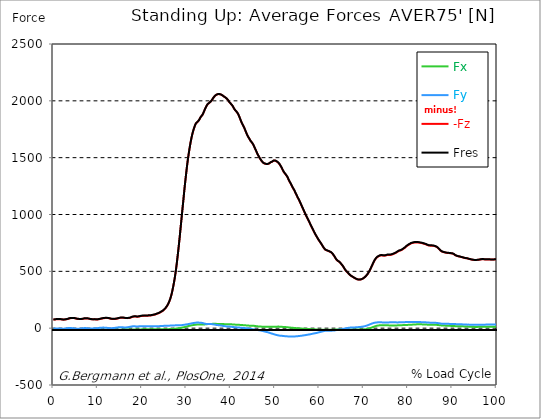
| Category |  Fx |  Fy |  -Fz |  Fres |
|---|---|---|---|---|
| 0.0 | -13.943 | -4.702 | 74.83 | 76.537 |
| 0.167348456675344 | -14.591 | -3.907 | 75.139 | 76.89 |
| 0.334696913350688 | -15.098 | -3.127 | 75.779 | 77.574 |
| 0.5020453700260321 | -15.4 | -2.789 | 77.03 | 78.855 |
| 0.669393826701376 | -15.694 | -2.45 | 78.281 | 80.128 |
| 0.83674228337672 | -15.694 | -2.156 | 78.597 | 80.407 |
| 1.0040907400520642 | -15.356 | -1.979 | 78.936 | 80.65 |
| 1.1621420602454444 | -14.995 | -1.972 | 79.201 | 80.812 |
| 1.3294905169207885 | -14.525 | -2.399 | 79.23 | 80.746 |
| 1.4968389735961325 | -13.781 | -3.171 | 78.708 | 80.128 |
| 1.6641874302714765 | -13.2 | -3.708 | 78.119 | 79.48 |
| 1.8315358869468206 | -12.744 | -4.268 | 77.111 | 78.487 |
| 1.9988843436221646 | -12.383 | -4.731 | 76.029 | 77.442 |
| 2.1662328002975086 | -12.251 | -4.753 | 75.213 | 76.618 |
| 2.333581256972853 | -12.332 | -4.407 | 74.823 | 76.199 |
| 2.5009297136481967 | -12.589 | -3.767 | 75.345 | 76.714 |
| 2.6682781703235405 | -12.825 | -3.024 | 76.36 | 77.714 |
| 2.8356266269988843 | -13.266 | -2.082 | 77.398 | 78.818 |
| 3.002975083674229 | -13.826 | -1.192 | 78.538 | 80.032 |
| 3.1703235403495724 | -14.436 | -0.412 | 79.841 | 81.386 |
| 3.337671997024917 | -15.157 | 0.434 | 81.975 | 83.608 |
| 3.4957233172182973 | -15.797 | 1.089 | 84.461 | 86.176 |
| 3.663071773893641 | -16.026 | 1.398 | 86.249 | 88.008 |
| 3.8304202305689854 | -15.974 | 1.31 | 87.618 | 89.34 |
| 3.997768687244329 | -15.613 | 0.846 | 88.295 | 89.958 |
| 4.165117143919673 | -15.179 | 0.324 | 88.788 | 90.37 |
| 4.332465600595017 | -14.642 | -0.316 | 89.009 | 90.51 |
| 4.499814057270361 | -13.929 | -1.155 | 88.781 | 90.201 |
| 4.667162513945706 | -13.156 | -2.112 | 88.273 | 89.619 |
| 4.834510970621049 | -12.325 | -3.157 | 87.206 | 88.494 |
| 5.001859427296393 | -11.581 | -4.098 | 85.83 | 87.096 |
| 5.169207883971737 | -11.133 | -4.635 | 84.241 | 85.506 |
| 5.336556340647081 | -10.691 | -5.04 | 82.578 | 83.843 |
| 5.503904797322425 | -10.522 | -5.084 | 81.562 | 82.828 |
| 5.671253253997769 | -10.559 | -4.9 | 80.738 | 81.997 |
| 5.82930457419115 | -10.816 | -4.415 | 80.113 | 81.364 |
| 5.996653030866494 | -11.169 | -3.797 | 79.649 | 80.908 |
| 6.164001487541838 | -11.626 | -3.009 | 79.657 | 80.944 |
| 6.331349944217181 | -12.06 | -2.259 | 80.054 | 81.393 |
| 6.498698400892526 | -12.663 | -1.317 | 80.878 | 82.291 |
| 6.66604685756787 | -13.23 | -0.53 | 82.232 | 83.733 |
| 6.833395314243213 | -13.546 | 0.088 | 83.645 | 85.271 |
| 7.000743770918558 | -13.811 | 0.662 | 85.021 | 86.757 |
| 7.168092227593902 | -13.796 | 0.831 | 85.712 | 87.434 |
| 7.335440684269246 | -13.399 | 0.567 | 86.058 | 87.706 |
| 7.50278914094459 | -12.634 | -0.103 | 86.154 | 87.692 |
| 7.6701375976199335 | -11.979 | -0.854 | 85.676 | 87.14 |
| 7.837486054295278 | -11.339 | -1.766 | 84.697 | 86.11 |
| 7.995537374488658 | -10.757 | -2.458 | 83.461 | 84.8 |
| 8.162885831164003 | -10.08 | -3.186 | 81.629 | 82.96 |
| 8.330234287839346 | -9.595 | -3.605 | 80.113 | 81.445 |
| 8.49758274451469 | -9.477 | -3.539 | 79.12 | 80.466 |
| 8.664931201190035 | -9.587 | -3.134 | 77.979 | 79.333 |
| 8.832279657865378 | -9.742 | -2.656 | 77.405 | 78.803 |
| 8.999628114540721 | -10.044 | -1.942 | 77.199 | 78.641 |
| 9.166976571216066 | -10.492 | -1.185 | 77.552 | 79.002 |
| 9.334325027891412 | -10.787 | -0.728 | 78.126 | 79.583 |
| 9.501673484566755 | -10.595 | -0.979 | 77.391 | 78.818 |
| 9.669021941242098 | -10.691 | -1.045 | 76.397 | 77.869 |
| 9.836370397917442 | -11.147 | -0.302 | 76.397 | 77.95 |
| 10.003718854592787 | -11.581 | 0.522 | 76.993 | 78.597 |
| 10.17106731126813 | -12.118 | 1.383 | 77.935 | 79.598 |
| 10.329118631461512 | -12.759 | 2.31 | 79.083 | 80.827 |
| 10.496467088136853 | -13.516 | 3.171 | 80.51 | 82.342 |
| 10.663815544812199 | -14.304 | 3.929 | 82.107 | 84.057 |
| 10.831164001487544 | -14.65 | 4.304 | 83.689 | 85.676 |
| 10.998512458162887 | -14.959 | 4.68 | 85.168 | 87.184 |
| 11.16586091483823 | -15.106 | 4.93 | 86.536 | 88.56 |
| 11.333209371513574 | -14.966 | 4.893 | 87.662 | 89.649 |
| 11.50055782818892 | -14.686 | 4.731 | 88.523 | 90.443 |
| 11.667906284864264 | -14.105 | 4.268 | 88.92 | 90.73 |
| 11.835254741539607 | -13.539 | 3.856 | 89.215 | 90.922 |
| 12.00260319821495 | -12.928 | 3.311 | 89.399 | 91.003 |
| 12.169951654890292 | -12.258 | 2.619 | 89.266 | 90.767 |
| 12.337300111565641 | -11.5 | 1.707 | 88.773 | 90.186 |
| 12.504648568240984 | -10.779 | 0.743 | 87.78 | 89.141 |
| 12.662699888434362 | -10.316 | 0.162 | 86.095 | 87.464 |
| 12.830048345109708 | -10.021 | -0.044 | 84.138 | 85.492 |
| 12.997396801785053 | -9.83 | -0.132 | 82.497 | 83.836 |
| 13.164745258460396 | -9.808 | 0.052 | 81.643 | 82.96 |
| 13.33209371513574 | -9.882 | 0.405 | 81.268 | 82.556 |
| 13.499442171811083 | -10.169 | 0.986 | 81.224 | 82.519 |
| 13.666790628486426 | -10.566 | 1.641 | 81.393 | 82.718 |
| 13.834139085161771 | -10.949 | 2.48 | 81.695 | 83.078 |
| 14.001487541837117 | -11.397 | 3.326 | 81.857 | 83.321 |
| 14.16883599851246 | -11.957 | 4.29 | 82.571 | 84.13 |
| 14.336184455187803 | -12.611 | 5.349 | 83.726 | 85.403 |
| 14.503532911863147 | -13.296 | 6.423 | 85.109 | 86.926 |
| 14.670881368538492 | -13.929 | 7.277 | 86.948 | 88.898 |
| 14.828932688731873 | -14.296 | 7.836 | 88.795 | 90.789 |
| 14.996281145407215 | -14.311 | 8.094 | 90.377 | 92.334 |
| 15.163629602082558 | -14.061 | 8.292 | 91.429 | 93.32 |
| 15.330978058757903 | -13.561 | 8.219 | 92.062 | 93.835 |
| 15.498326515433247 | -12.913 | 7.895 | 92.334 | 93.968 |
| 15.665674972108594 | -12.111 | 7.336 | 92.202 | 93.696 |
| 15.833023428783937 | -11.236 | 6.644 | 91.65 | 92.975 |
| 16.00037188545928 | -10.669 | 6.335 | 90.686 | 91.937 |
| 16.167720342134626 | -10.308 | 6.203 | 89.619 | 90.826 |
| 16.335068798809967 | -10.11 | 6.232 | 88.633 | 89.825 |
| 16.502417255485312 | -10.161 | 6.674 | 88.177 | 89.413 |
| 16.669765712160658 | -10.419 | 7.535 | 88.266 | 89.612 |
| 16.837114168836 | -10.787 | 8.631 | 88.597 | 90.09 |
| 17.004462625511344 | -11.228 | 9.86 | 89.2 | 90.878 |
| 17.16251394570472 | -11.714 | 11.199 | 90.009 | 91.893 |
| 17.32986240238007 | -12.273 | 12.501 | 91.172 | 93.276 |
| 17.497210859055414 | -12.817 | 13.848 | 93.328 | 95.668 |
| 17.664559315730756 | -13.075 | 15.216 | 96.985 | 99.486 |
| 17.8319077724061 | -13.024 | 15.93 | 99.199 | 101.745 |
| 17.999256229081443 | -12.825 | 16.32 | 100.921 | 103.46 |
| 18.166604685756788 | -12.538 | 16.371 | 101.87 | 104.372 |
| 18.333953142432133 | -12.126 | 16.165 | 102.319 | 104.769 |
| 18.501301599107478 | -11.522 | 15.621 | 102.334 | 104.688 |
| 18.668650055782823 | -11.133 | 15.334 | 101.576 | 103.886 |
| 18.835998512458165 | -10.787 | 15.106 | 100.745 | 103.018 |
| 19.00334696913351 | -10.625 | 15.209 | 100.73 | 102.974 |
| 19.170695425808855 | -10.72 | 15.591 | 101.495 | 103.739 |
| 19.338043882484197 | -10.927 | 16.04 | 102.297 | 104.585 |
| 19.496095202677576 | -10.853 | 16.386 | 103.813 | 106.153 |
| 19.66344365935292 | -10.941 | 17.056 | 105.542 | 108.029 |
| 19.830792116028263 | -10.809 | 17.446 | 106.94 | 109.508 |
| 19.998140572703612 | -10.301 | 17.159 | 107.999 | 110.516 |
| 20.165489029378953 | -10.066 | 16.997 | 108.154 | 110.634 |
| 20.3328374860543 | -10.095 | 17.115 | 108.088 | 110.582 |
| 20.500185942729644 | -10.242 | 17.409 | 108.654 | 111.156 |
| 20.667534399404985 | -9.742 | 17.004 | 108.676 | 111.119 |
| 20.83488285608033 | -9.389 | 16.644 | 108.434 | 110.832 |
| 21.002231312755672 | -9.212 | 16.467 | 108.228 | 110.604 |
| 21.16957976943102 | -9.05 | 16.68 | 108.765 | 111.208 |
| 21.336928226106362 | -8.991 | 17.115 | 109.684 | 112.223 |
| 21.504276682781704 | -9.116 | 17.482 | 111.082 | 113.694 |
| 21.67162513945705 | -8.984 | 17.372 | 112.046 | 114.607 |
| 21.82967645965043 | -8.829 | 16.931 | 111.987 | 114.438 |
| 21.997024916325774 | -8.682 | 16.489 | 111.921 | 114.261 |
| 22.16437337300112 | -8.756 | 16.577 | 112.517 | 114.82 |
| 22.33172182967646 | -8.91 | 16.894 | 114.504 | 116.844 |
| 22.499070286351806 | -8.822 | 16.989 | 116.24 | 118.558 |
| 22.666418743027148 | -8.8 | 16.931 | 117.535 | 119.831 |
| 22.833767199702496 | -8.778 | 16.872 | 118.83 | 121.097 |
| 23.00111565637784 | -8.903 | 16.732 | 120.295 | 122.502 |
| 23.168464113053183 | -9.168 | 16.931 | 122.583 | 124.79 |
| 23.335812569728528 | -9.727 | 17.534 | 126.026 | 128.3 |
| 23.50316102640387 | -10.066 | 17.777 | 129.014 | 131.287 |
| 23.670509483079215 | -9.823 | 17.313 | 130.331 | 132.494 |
| 23.83785793975456 | -10.007 | 17.622 | 133.171 | 135.334 |
| 23.995909259947936 | -10.25 | 18.049 | 136.254 | 138.447 |
| 24.163257716623285 | -10.47 | 18.498 | 139.558 | 141.765 |
| 24.330606173298627 | -10.492 | 18.991 | 144.208 | 146.437 |
| 24.49795462997397 | -10.404 | 19.248 | 148.115 | 150.322 |
| 24.665303086649313 | -10.308 | 19.506 | 152.015 | 154.207 |
| 24.83265154332466 | -10.272 | 20.102 | 157.607 | 159.762 |
| 25.0 | -10.11 | 20.529 | 163.441 | 165.546 |
| 25.167348456675345 | -9.882 | 20.852 | 169.357 | 171.403 |
| 25.334696913350694 | -9.624 | 21.08 | 177.407 | 179.379 |
| 25.502045370026035 | -9.374 | 21.309 | 186.244 | 188.142 |
| 25.669393826701377 | -9.161 | 21.632 | 195.882 | 197.707 |
| 25.836742283376722 | -8.844 | 21.743 | 207.317 | 209.053 |
| 26.004090740052067 | -8.491 | 21.802 | 220.546 | 222.187 |
| 26.17143919672741 | -8.226 | 21.978 | 236.314 | 237.852 |
| 26.329490516920792 | -7.969 | 22.464 | 253.495 | 254.952 |
| 26.49683897359613 | -7.866 | 23.03 | 273.817 | 275.208 |
| 26.66418743027148 | -7.593 | 23.56 | 298.113 | 299.423 |
| 26.831535886946828 | -6.997 | 23.972 | 326.007 | 327.221 |
| 26.998884343622166 | -6.232 | 24.141 | 357.779 | 358.89 |
| 27.166232800297514 | -5.732 | 24.281 | 391.883 | 392.905 |
| 27.333581256972852 | -5.43 | 24.494 | 428.466 | 429.415 |
| 27.5009297136482 | -4.849 | 24.649 | 470.001 | 470.877 |
| 27.668278170323543 | -3.9 | 24.723 | 515.444 | 516.239 |
| 27.835626626998888 | -2.951 | 24.759 | 566.552 | 567.266 |
| 28.002975083674233 | -2.163 | 24.848 | 621.891 | 622.538 |
| 28.170323540349575 | -1.53 | 25.127 | 678.363 | 678.952 |
| 28.33767199702492 | -0.736 | 25.473 | 738.713 | 739.257 |
| 28.50502045370026 | 0.346 | 25.856 | 801.476 | 801.983 |
| 28.663071773893645 | 1.56 | 25.907 | 867.586 | 868.057 |
| 28.830420230568986 | 2.943 | 26.172 | 932.984 | 933.425 |
| 28.99776868724433 | 4.253 | 26.783 | 998.874 | 999.315 |
| 29.165117143919673 | 5.504 | 27.607 | 1064.028 | 1064.477 |
| 29.33246560059502 | 6.909 | 28.828 | 1128.388 | 1128.851 |
| 29.499814057270367 | 8.631 | 29.88 | 1195.271 | 1195.757 |
| 29.66716251394571 | 10.316 | 30.852 | 1258.821 | 1259.329 |
| 29.834510970621054 | 11.905 | 31.654 | 1316.905 | 1317.427 |
| 30.00185942729639 | 13.715 | 32.846 | 1374.547 | 1375.106 |
| 30.169207883971744 | 15.533 | 33.957 | 1430.872 | 1431.468 |
| 30.33655634064708 | 17.247 | 35.09 | 1480.567 | 1481.207 |
| 30.50390479732243 | 18.969 | 36.451 | 1525.435 | 1526.127 |
| 30.671253253997772 | 20.484 | 37.643 | 1567.677 | 1568.406 |
| 30.829304574191156 | 21.875 | 38.894 | 1607.123 | 1607.896 |
| 30.996653030866494 | 23.266 | 40.446 | 1643.184 | 1644.001 |
| 31.164001487541842 | 24.73 | 42.05 | 1675.257 | 1676.126 |
| 31.331349944217187 | 26.076 | 43.338 | 1703.732 | 1704.645 |
| 31.498698400892525 | 27.173 | 44.457 | 1729.147 | 1730.088 |
| 31.666046857567874 | 28.137 | 45.59 | 1750.919 | 1751.89 |
| 31.833395314243212 | 29.086 | 46.664 | 1770.491 | 1771.499 |
| 32.00074377091856 | 30.094 | 47.532 | 1788.025 | 1789.062 |
| 32.1680922275939 | 30.933 | 48.636 | 1801.769 | 1802.851 |
| 32.33544068426925 | 31.477 | 49.158 | 1807.957 | 1809.054 |
| 32.50278914094459 | 31.933 | 49.386 | 1813.719 | 1814.83 |
| 32.670137597619934 | 32.287 | 49.298 | 1819.259 | 1820.37 |
| 32.83748605429528 | 32.5 | 48.901 | 1828.618 | 1829.707 |
| 33.004834510970625 | 32.64 | 48.4 | 1839.699 | 1840.766 |
| 33.162885831164004 | 32.699 | 47.79 | 1852.738 | 1853.782 |
| 33.33023428783935 | 32.809 | 47.194 | 1861.861 | 1862.884 |
| 33.497582744514695 | 32.75 | 46.259 | 1869.528 | 1870.514 |
| 33.664931201190036 | 32.654 | 45.141 | 1878.071 | 1879.02 |
| 33.83227965786538 | 32.816 | 43.603 | 1892.308 | 1893.213 |
| 33.99962811454073 | 32.816 | 41.351 | 1907.878 | 1908.731 |
| 34.16697657121607 | 33.096 | 38.916 | 1923.432 | 1924.249 |
| 34.33432502789141 | 33.582 | 38.18 | 1937.376 | 1938.185 |
| 34.50167348456676 | 34.479 | 37.805 | 1950.487 | 1951.312 |
| 34.6690219412421 | 35.083 | 36.841 | 1962.562 | 1963.379 |
| 34.83637039791744 | 35.965 | 36.841 | 1971.377 | 1972.208 |
| 35.00371885459279 | 36.422 | 36.974 | 1976.387 | 1977.233 |
| 35.17106731126814 | 36.929 | 36.672 | 1982.274 | 1983.127 |
| 35.338415767943474 | 37.15 | 36.436 | 1987.844 | 1988.697 |
| 35.49646708813686 | 37.283 | 36.252 | 1993.23 | 1994.09 |
| 35.6638155448122 | 37.444 | 35.826 | 2000.654 | 2001.5 |
| 35.831164001487544 | 37.65 | 35.141 | 2010.594 | 2011.433 |
| 35.998512458162885 | 38.004 | 34.185 | 2021.013 | 2021.837 |
| 36.165860914838234 | 38.401 | 33.184 | 2030.262 | 2031.079 |
| 36.333209371513576 | 38.651 | 32.029 | 2038.672 | 2039.474 |
| 36.50055782818892 | 38.644 | 30.572 | 2045.544 | 2046.324 |
| 36.667906284864266 | 38.21 | 29.262 | 2050.901 | 2051.659 |
| 36.83525474153961 | 37.709 | 28.137 | 2054.506 | 2055.235 |
| 37.002603198214956 | 37.209 | 27.504 | 2057.979 | 2058.686 |
| 37.1699516548903 | 36.981 | 26.834 | 2059.23 | 2059.929 |
| 37.337300111565646 | 36.797 | 25.915 | 2059.326 | 2060.01 |
| 37.50464856824098 | 36.848 | 25.127 | 2058.789 | 2059.473 |
| 37.66269988843437 | 36.863 | 24.215 | 2057.214 | 2057.891 |
| 37.83004834510971 | 36.819 | 23.067 | 2054.742 | 2055.419 |
| 37.99739680178505 | 36.701 | 21.919 | 2051.49 | 2052.166 |
| 38.16474525846039 | 36.392 | 20.779 | 2047.016 | 2047.678 |
| 38.33209371513574 | 35.796 | 19.557 | 2041.689 | 2042.329 |
| 38.49944217181109 | 35.443 | 18.513 | 2037.252 | 2037.885 |
| 38.666790628486424 | 35.377 | 17.652 | 2033.029 | 2033.654 |
| 38.83413908516178 | 35.252 | 16.747 | 2028.717 | 2029.342 |
| 39.001487541837115 | 35.053 | 15.812 | 2024.317 | 2024.935 |
| 39.16883599851246 | 34.847 | 15.187 | 2017.584 | 2018.195 |
| 39.336184455187805 | 34.604 | 14.856 | 2010.212 | 2010.83 |
| 39.503532911863154 | 34.45 | 14.591 | 2001.419 | 2002.03 |
| 39.670881368538495 | 34.06 | 14.738 | 1990.411 | 1991.022 |
| 39.83822982521384 | 33.868 | 13.929 | 1983.076 | 1983.686 |
| 39.996281145407224 | 33.751 | 13.046 | 1975.968 | 1976.579 |
| 40.163629602082565 | 33.596 | 12.118 | 1968.728 | 1969.338 |
| 40.33097805875791 | 33.272 | 11.39 | 1960.318 | 1960.928 |
| 40.498326515433256 | 32.919 | 10.662 | 1951.341 | 1951.959 |
| 40.6656749721086 | 32.345 | 9.882 | 1938.604 | 1939.222 |
| 40.83302342878393 | 31.749 | 9.036 | 1927.568 | 1928.186 |
| 41.00037188545929 | 31.234 | 8.285 | 1918.731 | 1919.349 |
| 41.16772034213463 | 30.771 | 7.674 | 1911.387 | 1912.006 |
| 41.33506879880997 | 30.447 | 7.064 | 1903.816 | 1904.449 |
| 41.50241725548531 | 30.212 | 6.446 | 1896.112 | 1896.753 |
| 41.66976571216066 | 29.925 | 5.975 | 1885.782 | 1886.422 |
| 41.837114168836 | 29.586 | 5.599 | 1871.125 | 1871.772 |
| 42.004462625511344 | 29.159 | 5.033 | 1855.188 | 1855.828 |
| 42.17181108218669 | 28.519 | 4.422 | 1838.309 | 1838.956 |
| 42.32986240238007 | 27.82 | 3.694 | 1821.974 | 1822.614 |
| 42.497210859055414 | 27.165 | 3.223 | 1806.081 | 1806.714 |
| 42.66455931573076 | 26.908 | 2.693 | 1793.021 | 1793.661 |
| 42.831907772406105 | 26.643 | 2.207 | 1780.954 | 1781.601 |
| 42.999256229081446 | 26.349 | 1.678 | 1768.328 | 1768.975 |
| 43.16660468575679 | 25.525 | 0.831 | 1752.751 | 1753.406 |
| 43.33395314243214 | 24.892 | 0.125 | 1736.483 | 1737.13 |
| 43.50130159910748 | 24.436 | -0.346 | 1720.597 | 1721.252 |
| 43.66865005578282 | 23.906 | -0.839 | 1705.469 | 1706.116 |
| 43.83599851245817 | 23.133 | -1.472 | 1691.114 | 1691.768 |
| 44.00334696913351 | 22.655 | -2.428 | 1679.65 | 1680.312 |
| 44.17069542580886 | 22.42 | -3.613 | 1670.32 | 1670.997 |
| 44.3380438824842 | 21.963 | -4.738 | 1657.547 | 1658.246 |
| 44.49609520267758 | 21.765 | -6.011 | 1646.532 | 1647.246 |
| 44.66344365935292 | 21.802 | -7.233 | 1638.762 | 1639.513 |
| 44.83079211602827 | 21.618 | -8.587 | 1631.169 | 1631.963 |
| 44.99814057270361 | 21.426 | -9.676 | 1620.978 | 1621.802 |
| 45.16548902937895 | 21.139 | -10.632 | 1609.043 | 1609.882 |
| 45.332837486054295 | 20.278 | -11.699 | 1594.225 | 1595.071 |
| 45.500185942729644 | 19.476 | -12.545 | 1580.053 | 1580.914 |
| 45.66753439940499 | 18.63 | -13.524 | 1565.911 | 1566.787 |
| 45.83488285608033 | 17.49 | -14.583 | 1551.159 | 1552.056 |
| 46.00223131275568 | 16.423 | -15.672 | 1536.296 | 1537.208 |
| 46.16957976943102 | 15.65 | -16.82 | 1523.11 | 1524.06 |
| 46.336928226106366 | 15.032 | -17.806 | 1511.374 | 1512.346 |
| 46.50427668278171 | 14.591 | -18.844 | 1499.617 | 1500.61 |
| 46.671625139457056 | 14.193 | -20.065 | 1488.962 | 1489.978 |
| 46.829676459650436 | 13.811 | -21.235 | 1479.132 | 1480.162 |
| 46.99702491632577 | 13.406 | -22.434 | 1470.001 | 1471.038 |
| 47.16437337300112 | 12.913 | -24.185 | 1462.106 | 1463.143 |
| 47.33172182967646 | 12.494 | -26.025 | 1455.064 | 1456.109 |
| 47.49907028635181 | 12.428 | -27.806 | 1450.569 | 1451.606 |
| 47.66641874302716 | 12.597 | -29.498 | 1448.251 | 1449.281 |
| 47.83376719970249 | 12.729 | -31.205 | 1446.61 | 1447.662 |
| 48.001115656377834 | 12.795 | -32.434 | 1444.263 | 1445.33 |
| 48.16846411305319 | 12.832 | -33.765 | 1442.519 | 1443.615 |
| 48.33581256972853 | 12.935 | -35.487 | 1443.667 | 1444.771 |
| 48.50316102640387 | 13.06 | -37.18 | 1446.073 | 1447.169 |
| 48.67050948307921 | 13.156 | -39.365 | 1448.81 | 1449.899 |
| 48.837857939754564 | 12.626 | -41.786 | 1453.644 | 1454.777 |
| 49.005206396429905 | 12.082 | -44.228 | 1458.611 | 1459.81 |
| 49.163257716623285 | 12.074 | -46.237 | 1460.178 | 1461.414 |
| 49.33060617329863 | 12.339 | -48.091 | 1463.835 | 1465.123 |
| 49.49795462997397 | 12.582 | -50.041 | 1468.625 | 1469.979 |
| 49.66530308664932 | 12.589 | -52.094 | 1473.018 | 1474.43 |
| 49.832651543324666 | 12.413 | -54.449 | 1474.747 | 1476.226 |
| 50.0 | 12.383 | -56.788 | 1474.372 | 1475.924 |
| 50.16734845667534 | 12.751 | -58.422 | 1472.664 | 1474.283 |
| 50.33469691335069 | 12.854 | -59.761 | 1467.926 | 1469.589 |
| 50.50204537002604 | 13.362 | -61.233 | 1463.798 | 1465.513 |
| 50.66939382670139 | 13.87 | -62.822 | 1458.523 | 1460.274 |
| 50.836742283376715 | 13.649 | -64.065 | 1451.746 | 1453.556 |
| 51.00409074005207 | 13.347 | -65.493 | 1443.718 | 1445.595 |
| 51.17143919672741 | 13.038 | -66.582 | 1433.557 | 1435.478 |
| 51.32949051692079 | 12.678 | -67.259 | 1422.712 | 1424.654 |
| 51.496838973596134 | 12.185 | -67.575 | 1410.52 | 1412.469 |
| 51.66418743027148 | 11.412 | -67.818 | 1397.091 | 1399.056 |
| 51.831535886946824 | 10.36 | -68.326 | 1384.083 | 1386.099 |
| 51.99888434362217 | 9.889 | -69.363 | 1373.024 | 1375.091 |
| 52.16623280029752 | 9.705 | -70.378 | 1364.032 | 1366.159 |
| 52.33358125697285 | 9.528 | -70.974 | 1355.637 | 1357.8 |
| 52.5009297136482 | 9.293 | -71.298 | 1347.308 | 1349.493 |
| 52.668278170323546 | 8.866 | -71.784 | 1337.941 | 1340.148 |
| 52.835626626998895 | 8.057 | -72.343 | 1326.301 | 1328.523 |
| 53.00297508367424 | 7.071 | -72.843 | 1312.321 | 1314.572 |
| 53.17032354034958 | 6.203 | -73.329 | 1298.517 | 1300.806 |
| 53.33767199702492 | 5.437 | -73.587 | 1286.024 | 1288.334 |
| 53.50502045370027 | 4.93 | -73.329 | 1274.067 | 1276.37 |
| 53.663071773893655 | 4.282 | -73.314 | 1260.83 | 1263.148 |
| 53.83042023056899 | 3.679 | -73.366 | 1247.696 | 1250.029 |
| 53.99776868724433 | 3.002 | -73.116 | 1235.916 | 1238.249 |
| 54.16511714391967 | 2.502 | -72.77 | 1224.872 | 1227.197 |
| 54.33246560059503 | 1.92 | -72.755 | 1213.592 | 1215.917 |
| 54.49981405727037 | 1.258 | -72.321 | 1199.826 | 1202.136 |
| 54.667162513945705 | 0.618 | -72.108 | 1186.353 | 1188.678 |
| 54.834510970621054 | -0.14 | -71.607 | 1172.55 | 1174.875 |
| 55.0018594272964 | -0.824 | -70.849 | 1158.776 | 1161.072 |
| 55.169207883971744 | -1.295 | -70.091 | 1145.458 | 1147.724 |
| 55.336556340647086 | -1.722 | -69.569 | 1133.398 | 1135.657 |
| 55.50390479732243 | -2.215 | -68.826 | 1120.265 | 1122.494 |
| 55.671253253997776 | -2.767 | -67.965 | 1106.159 | 1108.359 |
| 55.83860171067312 | -3.237 | -67.178 | 1091.628 | 1093.805 |
| 55.9966530308665 | -3.576 | -66.346 | 1077.103 | 1079.259 |
| 56.16400148754184 | -3.988 | -65.338 | 1062.542 | 1064.661 |
| 56.33134994421718 | -4.334 | -64.205 | 1048.54 | 1050.615 |
| 56.498698400892536 | -4.709 | -63.307 | 1034.03 | 1036.075 |
| 56.66604685756788 | -5.231 | -62.373 | 1019.417 | 1021.44 |
| 56.83339531424321 | -5.791 | -61.225 | 1005.157 | 1007.144 |
| 57.00074377091856 | -6.166 | -60.158 | 991.324 | 993.274 |
| 57.16809222759391 | -6.357 | -58.907 | 977.764 | 979.67 |
| 57.33544068426925 | -6.843 | -57.59 | 964.402 | 966.256 |
| 57.5027891409446 | -7.189 | -56.73 | 952.224 | 954.057 |
| 57.670137597619934 | -7.542 | -55.538 | 938.796 | 940.592 |
| 57.83748605429528 | -7.851 | -54.765 | 924.963 | 926.744 |
| 58.004834510970625 | -8.226 | -53.463 | 911.513 | 913.257 |
| 58.16288583116401 | -8.756 | -51.881 | 898.254 | 899.939 |
| 58.330234287839346 | -9.146 | -50.343 | 885.209 | 886.842 |
| 58.497582744514695 | -9.565 | -48.864 | 871.729 | 873.311 |
| 58.66493120119004 | -9.86 | -47.444 | 858.323 | 859.861 |
| 58.832279657865385 | -9.992 | -46.237 | 845.174 | 846.683 |
| 58.999628114540734 | -10.331 | -45.156 | 832.548 | 834.034 |
| 59.16697657121607 | -10.875 | -43.765 | 820.739 | 822.195 |
| 59.33432502789142 | -11.567 | -42.227 | 809.613 | 811.033 |
| 59.50167348456676 | -12.457 | -40.881 | 798.672 | 800.063 |
| 59.66902194124211 | -13.009 | -39.225 | 787.606 | 788.96 |
| 59.83637039791745 | -13.583 | -37.327 | 776.591 | 777.901 |
| 60.00371885459278 | -14.23 | -35.553 | 766.952 | 768.21 |
| 60.17106731126813 | -14.929 | -33.913 | 758.63 | 759.837 |
| 60.33841576794349 | -15.018 | -32.544 | 748.344 | 749.499 |
| 60.49646708813685 | -15.062 | -30.903 | 737.977 | 739.11 |
| 60.6638155448122 | -15.062 | -29.167 | 727.639 | 728.765 |
| 60.831164001487544 | -14.988 | -27.313 | 716.734 | 717.845 |
| 60.99851245816289 | -14.944 | -25.503 | 706.691 | 707.802 |
| 61.16586091483824 | -14.826 | -24.105 | 697.913 | 699.031 |
| 61.333209371513576 | -14.878 | -22.993 | 690.673 | 691.806 |
| 61.50055782818892 | -15.135 | -21.956 | 686.148 | 687.273 |
| 61.667906284864266 | -15.076 | -21.919 | 684.882 | 686.015 |
| 61.835254741539615 | -14.708 | -22.272 | 683.285 | 684.433 |
| 62.002603198214956 | -14.215 | -22.758 | 679.628 | 680.813 |
| 62.16995165489029 | -14.098 | -22.839 | 676.362 | 677.554 |
| 62.33730011156564 | -14.201 | -22.677 | 673.742 | 674.934 |
| 62.504648568240995 | -14.296 | -22.523 | 671.057 | 672.256 |
| 62.67199702491633 | -14.098 | -22.493 | 667.017 | 668.231 |
| 62.83004834510971 | -13.789 | -21.89 | 661.05 | 662.286 |
| 62.99739680178505 | -13.458 | -21.448 | 654.074 | 655.325 |
| 63.1647452584604 | -13.09 | -20.948 | 645.517 | 646.768 |
| 63.33209371513575 | -12.744 | -20.477 | 636.003 | 637.254 |
| 63.4994421718111 | -12.273 | -19.616 | 625.702 | 626.946 |
| 63.666790628486424 | -11.773 | -18.284 | 614.482 | 615.703 |
| 63.83413908516177 | -11.449 | -16.879 | 604.843 | 606.049 |
| 64.00148754183712 | -11.265 | -15.444 | 596.999 | 598.191 |
| 64.16883599851248 | -11.206 | -14.363 | 591.341 | 592.511 |
| 64.3361844551878 | -11.213 | -13.296 | 588.515 | 589.678 |
| 64.50353291186315 | -11.125 | -12.317 | 584.461 | 585.602 |
| 64.6708813685385 | -10.912 | -11.442 | 577.339 | 578.472 |
| 64.83822982521384 | -10.603 | -10.537 | 569.664 | 570.805 |
| 65.00557828188919 | -10.301 | -9.558 | 562.13 | 563.256 |
| 65.16362960208257 | -10.169 | -8.241 | 553.823 | 554.934 |
| 65.3309780587579 | -10.014 | -7.019 | 544.905 | 545.979 |
| 65.49832651543326 | -9.83 | -5.673 | 534.965 | 536.009 |
| 65.6656749721086 | -9.874 | -4.017 | 523.773 | 524.774 |
| 65.83302342878395 | -9.904 | -2.391 | 513.487 | 514.443 |
| 66.00037188545929 | -9.948 | -0.927 | 505.15 | 506.085 |
| 66.16772034213463 | -10.11 | 0.155 | 498.278 | 499.19 |
| 66.33506879880998 | -10.272 | 0.876 | 492.23 | 493.135 |
| 66.50241725548531 | -10.382 | 1.987 | 484.769 | 485.652 |
| 66.66976571216065 | -10.654 | 3.215 | 477.757 | 478.632 |
| 66.83711416883601 | -10.809 | 4.268 | 471.061 | 471.922 |
| 67.00446262551135 | -10.963 | 5.29 | 465.05 | 465.888 |
| 67.1718110821867 | -11.213 | 5.908 | 460.304 | 461.106 |
| 67.32986240238007 | -11.427 | 5.857 | 456.205 | 456.963 |
| 67.49721085905541 | -11.729 | 5.798 | 452.549 | 453.27 |
| 67.66455931573076 | -11.876 | 6.409 | 448.825 | 449.517 |
| 67.83190777240611 | -11.89 | 6.813 | 444.44 | 445.102 |
| 67.99925622908145 | -11.957 | 6.593 | 440.253 | 440.886 |
| 68.16660468575678 | -12.008 | 7.167 | 436.714 | 437.325 |
| 68.33395314243214 | -11.854 | 7.755 | 432.829 | 433.425 |
| 68.50130159910749 | -12.052 | 8.322 | 430.725 | 431.314 |
| 68.66865005578282 | -12.096 | 8.719 | 428.893 | 429.467 |
| 68.83599851245816 | -11.802 | 9.139 | 427.362 | 427.922 |
| 69.00334696913352 | -11.905 | 9.83 | 427.37 | 427.936 |
| 69.17069542580886 | -11.854 | 10.537 | 427.392 | 427.958 |
| 69.3380438824842 | -11.809 | 11.177 | 428.12 | 428.687 |
| 69.50539233915956 | -11.67 | 11.92 | 430.225 | 430.813 |
| 69.66344365935292 | -11.456 | 12.84 | 432.859 | 433.455 |
| 69.83079211602826 | -11.177 | 13.87 | 436.405 | 437.016 |
| 69.99814057270362 | -10.772 | 15.032 | 440.607 | 441.232 |
| 70.16548902937896 | -10.36 | 16.467 | 445.772 | 446.427 |
| 70.33283748605429 | -9.668 | 18.152 | 451.239 | 451.938 |
| 70.50018594272964 | -8.675 | 20.028 | 457.567 | 458.31 |
| 70.667534399405 | -7.645 | 22.243 | 464.998 | 465.815 |
| 70.83488285608033 | -6.446 | 24.612 | 473.349 | 474.262 |
| 71.00223131275568 | -4.967 | 27.048 | 482.635 | 483.658 |
| 71.16957976943102 | -3.208 | 29.616 | 493.311 | 494.459 |
| 71.33692822610637 | -1.31 | 32.309 | 505.099 | 506.408 |
| 71.50427668278171 | 0.721 | 34.957 | 517.74 | 519.226 |
| 71.67162513945706 | 3.083 | 37.496 | 531.116 | 532.772 |
| 71.8389735961324 | 5.747 | 40.101 | 544.883 | 546.752 |
| 71.99702491632577 | 8.13 | 42.36 | 558.723 | 560.783 |
| 72.16437337300113 | 10.713 | 44.81 | 573.763 | 576.029 |
| 72.33172182967647 | 13.193 | 46.576 | 586.499 | 588.927 |
| 72.49907028635181 | 15.555 | 47.959 | 598.154 | 600.715 |
| 72.66641874302715 | 17.784 | 49.033 | 608.227 | 610.898 |
| 72.8337671997025 | 19.83 | 49.931 | 616.792 | 619.558 |
| 73.00111565637783 | 21.456 | 50.63 | 623.304 | 626.166 |
| 73.16846411305319 | 22.758 | 51.27 | 628.491 | 631.427 |
| 73.33581256972853 | 23.766 | 51.807 | 632.096 | 635.106 |
| 73.50316102640387 | 24.605 | 51.998 | 635.187 | 638.248 |
| 73.67050948307921 | 25.4 | 52.094 | 638.137 | 641.235 |
| 73.83785793975457 | 25.26 | 51.733 | 640.219 | 643.325 |
| 74.00520639642991 | 25.238 | 51.307 | 640.86 | 643.987 |
| 74.16325771662328 | 25.444 | 50.814 | 639.631 | 642.773 |
| 74.33060617329863 | 25.591 | 50.343 | 638.52 | 641.698 |
| 74.49795462997398 | 25.62 | 49.916 | 637.71 | 640.926 |
| 74.66530308664932 | 25.539 | 49.578 | 637.607 | 640.852 |
| 74.83265154332466 | 25.355 | 49.327 | 638.167 | 641.426 |
| 75.00000000000001 | 25.274 | 49.327 | 639.616 | 642.898 |
| 75.16734845667534 | 25.326 | 49.71 | 642.199 | 645.51 |
| 75.3346969133507 | 25.208 | 50.049 | 644.016 | 647.349 |
| 75.50204537002605 | 24.892 | 50.38 | 644.134 | 647.445 |
| 75.66939382670138 | 24.546 | 50.703 | 644.024 | 647.305 |
| 75.83674228337672 | 24.34 | 51.064 | 644.252 | 647.511 |
| 76.00409074005208 | 24.171 | 51.432 | 644.59 | 647.828 |
| 76.17143919672742 | 24.046 | 51.756 | 645.812 | 649.027 |
| 76.33878765340276 | 23.935 | 52.065 | 647.276 | 650.462 |
| 76.49683897359614 | 23.876 | 52.079 | 649.527 | 652.684 |
| 76.66418743027148 | 23.84 | 51.947 | 652.176 | 655.303 |
| 76.83153588694682 | 23.994 | 51.748 | 654.928 | 658.048 |
| 76.99888434362218 | 24.288 | 51.505 | 657.768 | 660.895 |
| 77.16623280029752 | 24.259 | 51.645 | 660.719 | 663.883 |
| 77.33358125697285 | 24.244 | 51.079 | 664.677 | 667.826 |
| 77.5009297136482 | 24.303 | 50.402 | 668.709 | 671.836 |
| 77.66827817032356 | 24.671 | 50.446 | 673.073 | 676.214 |
| 77.83562662699889 | 24.995 | 50.858 | 677.804 | 680.96 |
| 78.00297508367423 | 25.238 | 51.447 | 680.74 | 683.933 |
| 78.17032354034959 | 25.966 | 51.248 | 682.204 | 685.419 |
| 78.33767199702493 | 26.305 | 51.329 | 683.712 | 686.957 |
| 78.50502045370027 | 26.363 | 51.682 | 686.545 | 689.827 |
| 78.67236891037561 | 26.518 | 51.991 | 690.342 | 693.66 |
| 78.83042023056899 | 26.981 | 52.241 | 694.543 | 697.906 |
| 78.99776868724433 | 27.438 | 52.329 | 699.281 | 702.688 |
| 79.16511714391969 | 27.497 | 52.675 | 703.461 | 706.897 |
| 79.33246560059503 | 27.592 | 52.94 | 708.479 | 711.967 |
| 79.49981405727036 | 27.688 | 53.588 | 714.056 | 717.617 |
| 79.66716251394571 | 28.379 | 54.794 | 720.502 | 724.188 |
| 79.83451097062107 | 28.703 | 55.14 | 726.197 | 729.927 |
| 80.00185942729641 | 28.983 | 55.199 | 730.067 | 733.812 |
| 80.16920788397174 | 29.38 | 55.133 | 734.136 | 737.903 |
| 80.33655634064709 | 29.616 | 54.596 | 737.454 | 741.229 |
| 80.50390479732243 | 29.939 | 54.243 | 741.612 | 745.401 |
| 80.67125325399778 | 30.454 | 54.235 | 745.357 | 749.146 |
| 80.83860171067312 | 30.741 | 53.985 | 747.218 | 751 |
| 80.99665303086651 | 31.175 | 53.683 | 749.33 | 753.105 |
| 81.16400148754184 | 31.639 | 53.963 | 751.707 | 755.525 |
| 81.3313499442172 | 32.036 | 54.029 | 752.347 | 756.166 |
| 81.49869840089255 | 32.36 | 54.132 | 753.62 | 757.468 |
| 81.66604685756786 | 32.669 | 54.272 | 754.576 | 758.439 |
| 81.83339531424322 | 33.118 | 54.235 | 754.951 | 758.822 |
| 82.00074377091858 | 33.67 | 54.073 | 754.62 | 758.483 |
| 82.16809222759392 | 34.052 | 53.831 | 753.988 | 757.843 |
| 82.33544068426926 | 33.979 | 53.735 | 753.362 | 757.196 |
| 82.50278914094459 | 33.964 | 53.654 | 752.428 | 756.246 |
| 82.67013759761994 | 33.979 | 53.595 | 751.28 | 755.084 |
| 82.83748605429528 | 34.023 | 53.463 | 750.367 | 754.135 |
| 83.00483451097062 | 33.64 | 53.087 | 749.345 | 753.046 |
| 83.17218296764597 | 33.228 | 52.83 | 748.131 | 751.765 |
| 83.33023428783935 | 33.059 | 52.403 | 746.004 | 749.588 |
| 83.4975827445147 | 32.941 | 51.844 | 743.525 | 747.049 |
| 83.66493120119004 | 32.824 | 51.697 | 741.869 | 745.342 |
| 83.83227965786537 | 32.257 | 51.645 | 740.243 | 743.657 |
| 83.99962811454073 | 31.646 | 51.38 | 738.139 | 741.479 |
| 84.16697657121607 | 31.205 | 50.858 | 735.372 | 738.632 |
| 84.33432502789142 | 31.05 | 50.262 | 732.12 | 735.328 |
| 84.50167348456677 | 30.925 | 49.467 | 729.044 | 732.186 |
| 84.6690219412421 | 30.786 | 49.011 | 727.278 | 730.376 |
| 84.83637039791745 | 30.653 | 48.636 | 725.947 | 729.007 |
| 85.0037188545928 | 30.543 | 48.503 | 725.998 | 729.015 |
| 85.17106731126813 | 30.432 | 48.371 | 726.042 | 729.022 |
| 85.33841576794349 | 30.322 | 48.231 | 726.064 | 729.007 |
| 85.50576422461883 | 30.366 | 48.04 | 725.424 | 728.323 |
| 85.66381554481221 | 30.403 | 47.841 | 724.784 | 727.646 |
| 85.83116400148755 | 30.035 | 47.459 | 723.276 | 726.079 |
| 85.99851245816289 | 29.66 | 47.076 | 721.775 | 724.512 |
| 86.16586091483823 | 29.579 | 46.899 | 719.575 | 722.282 |
| 86.33320937151358 | 29.505 | 46.73 | 717.367 | 720.038 |
| 86.50055782818893 | 28.961 | 46.141 | 713.961 | 716.55 |
| 86.66790628486427 | 28.299 | 45.457 | 709.318 | 711.834 |
| 86.83525474153961 | 27.577 | 44.508 | 704.094 | 706.507 |
| 87.00260319821496 | 26.636 | 43.036 | 696.89 | 699.164 |
| 87.16995165489031 | 25.583 | 41.521 | 689.334 | 691.46 |
| 87.33730011156564 | 24.958 | 40.608 | 682.711 | 684.75 |
| 87.504648568241 | 24.369 | 39.792 | 677.355 | 679.312 |
| 87.67199702491634 | 23.994 | 39.232 | 673.654 | 675.56 |
| 87.83004834510972 | 23.7 | 38.982 | 671.233 | 673.102 |
| 87.99739680178506 | 23.457 | 38.901 | 669.482 | 671.336 |
| 88.1647452584604 | 23.045 | 38.607 | 667.959 | 669.776 |
| 88.33209371513574 | 22.508 | 38.283 | 665.774 | 667.547 |
| 88.49944217181108 | 22.111 | 38.173 | 664.03 | 665.781 |
| 88.66679062848644 | 21.89 | 38.166 | 662.933 | 664.677 |
| 88.83413908516178 | 21.64 | 38.232 | 662.19 | 663.919 |
| 89.00148754183712 | 21.382 | 38.298 | 661.778 | 663.5 |
| 89.16883599851246 | 20.977 | 37.893 | 660.822 | 662.507 |
| 89.33618445518782 | 20.698 | 37.724 | 660.417 | 662.08 |
| 89.50353291186315 | 20.168 | 37.503 | 658.931 | 660.564 |
| 89.6708813685385 | 20.014 | 37.452 | 658.585 | 660.196 |
| 89.83822982521386 | 19.852 | 37.349 | 658.283 | 659.887 |
| 90.00557828188919 | 19.579 | 37.121 | 657.452 | 659.026 |
| 90.16362960208257 | 19.05 | 36.687 | 655.428 | 656.973 |
| 90.3309780587579 | 18.468 | 36.186 | 651.661 | 653.155 |
| 90.49832651543326 | 17.961 | 35.759 | 647.283 | 648.74 |
| 90.66567497210859 | 17.88 | 35.693 | 641.882 | 643.347 |
| 90.83302342878395 | 17.696 | 35.634 | 638.652 | 640.102 |
| 91.00037188545929 | 17.328 | 35.377 | 636.143 | 637.578 |
| 91.16772034213463 | 17.159 | 35.149 | 633.59 | 635.01 |
| 91.33506879880998 | 16.901 | 34.869 | 632.118 | 633.509 |
| 91.50241725548533 | 16.901 | 34.715 | 630.742 | 632.111 |
| 91.66976571216065 | 17.085 | 34.612 | 629.624 | 630.978 |
| 91.83711416883601 | 16.894 | 34.317 | 628.094 | 629.433 |
| 92.00446262551137 | 16.666 | 33.935 | 625.71 | 627.019 |
| 92.1718110821867 | 16.379 | 33.582 | 624.268 | 625.54 |
| 92.33915953886203 | 16.077 | 33.243 | 622.671 | 623.914 |
| 92.49721085905541 | 15.797 | 32.794 | 620.979 | 622.178 |
| 92.66455931573077 | 15.54 | 32.294 | 618.808 | 619.971 |
| 92.83190777240611 | 15.246 | 31.904 | 617.02 | 618.153 |
| 92.99925622908145 | 14.856 | 31.639 | 615.843 | 616.946 |
| 93.1666046857568 | 14.407 | 31.382 | 615.232 | 616.306 |
| 93.33395314243214 | 13.943 | 31.102 | 614.636 | 615.688 |
| 93.50130159910749 | 13.686 | 31.168 | 612.833 | 613.878 |
| 93.66865005578283 | 13.502 | 31.212 | 610.265 | 611.303 |
| 93.83599851245818 | 13.112 | 30.741 | 608.529 | 609.544 |
| 94.00334696913353 | 12.817 | 30.329 | 606.91 | 607.904 |
| 94.17069542580886 | 12.538 | 29.888 | 605.542 | 606.506 |
| 94.3380438824842 | 12.339 | 29.711 | 603.643 | 604.607 |
| 94.50539233915954 | 12.001 | 29.52 | 602.473 | 603.43 |
| 94.66344365935292 | 11.692 | 29.395 | 601.355 | 602.312 |
| 94.83079211602828 | 11.486 | 29.505 | 600.354 | 601.318 |
| 94.99814057270362 | 11.324 | 29.579 | 599.523 | 600.487 |
| 95.16548902937897 | 11.331 | 29.542 | 599.206 | 600.178 |
| 95.33283748605432 | 11.331 | 29.505 | 598.897 | 599.869 |
| 95.50018594272963 | 11.272 | 29.66 | 599.788 | 600.766 |
| 95.66753439940499 | 11.272 | 29.866 | 600.671 | 601.664 |
| 95.83488285608034 | 11.508 | 30.138 | 601.009 | 602.01 |
| 96.00223131275567 | 11.67 | 30.403 | 602.128 | 603.136 |
| 96.16957976943102 | 11.795 | 30.675 | 603.607 | 604.622 |
| 96.33692822610638 | 12.06 | 30.646 | 604.541 | 605.556 |
| 96.50427668278171 | 12.325 | 30.624 | 605.475 | 606.491 |
| 96.67162513945706 | 12.273 | 30.668 | 606.579 | 607.602 |
| 96.8389735961324 | 12.199 | 30.638 | 607.285 | 608.301 |
| 96.99702491632577 | 12.251 | 30.624 | 606.947 | 607.962 |
| 97.16437337300111 | 12.383 | 30.719 | 605.983 | 607.013 |
| 97.33172182967647 | 12.472 | 30.889 | 605.005 | 606.042 |
| 97.49907028635181 | 12.479 | 31.095 | 604.32 | 605.365 |
| 97.66641874302715 | 12.486 | 31.374 | 604.232 | 605.291 |
| 97.8337671997025 | 12.472 | 31.683 | 604.239 | 605.321 |
| 98.00111565637785 | 12.383 | 32.073 | 604.6 | 605.689 |
| 98.16846411305319 | 12.295 | 32.367 | 604.879 | 605.99 |
| 98.33581256972855 | 12.207 | 32.257 | 604.879 | 605.99 |
| 98.50316102640389 | 12.155 | 32.294 | 604.489 | 605.6 |
| 98.67050948307921 | 12.199 | 32.323 | 603.695 | 604.813 |
| 98.83785793975456 | 12.266 | 32.316 | 603.246 | 604.372 |
| 99.0052063964299 | 12.236 | 32.294 | 603.253 | 604.379 |
| 99.17255485310525 | 12.074 | 32.573 | 603.143 | 604.283 |
| 99.33060617329863 | 12.082 | 32.47 | 603.32 | 604.467 |
| 99.49795462997399 | 12.038 | 32.441 | 604.019 | 605.159 |
| 99.66530308664933 | 11.854 | 32.684 | 605.505 | 606.66 |
| 99.83265154332467 | 11.979 | 32.765 | 605.571 | 606.726 |
| 100.0 | 12.045 | 33.008 | 606.093 | 607.263 |